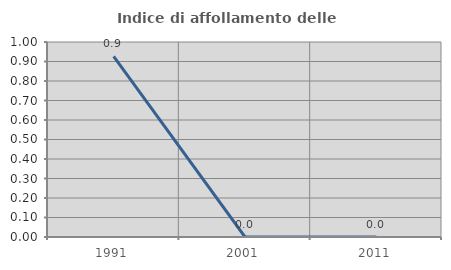
| Category | Indice di affollamento delle abitazioni  |
|---|---|
| 1991.0 | 0.926 |
| 2001.0 | 0 |
| 2011.0 | 0 |